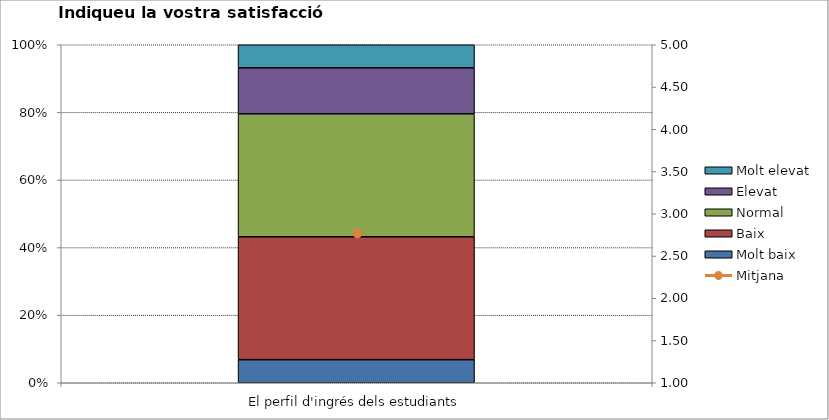
| Category | Molt baix | Baix | Normal  | Elevat | Molt elevat |
|---|---|---|---|---|---|
| El perfil d'ingrés dels estudiants | 3 | 16 | 16 | 6 | 3 |